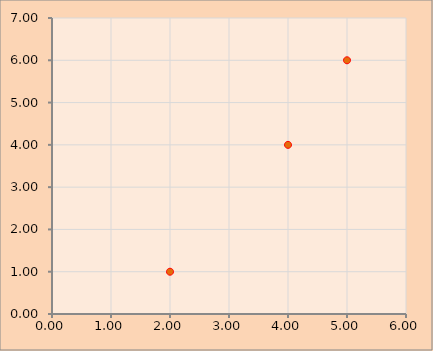
| Category | Series 0 |
|---|---|
| 2.0 | 1 |
| 4.0 | 4 |
| 5.0 | 6 |